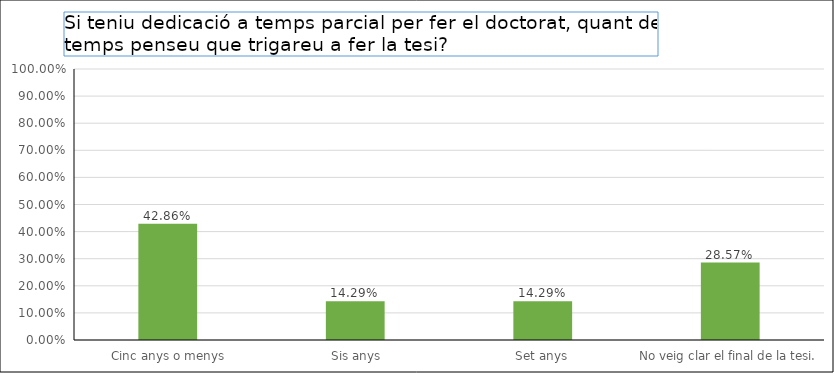
| Category | Series 0 |
|---|---|
|  Cinc anys o menys | 0.429 |
|  Sis anys | 0.143 |
| Set anys | 0.143 |
| No veig clar el final de la tesi. | 0.286 |